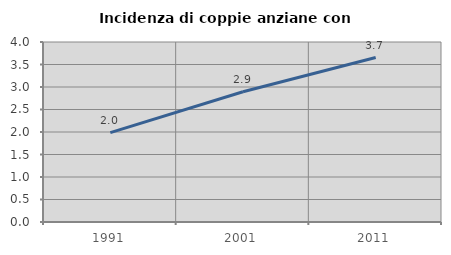
| Category | Incidenza di coppie anziane con figli |
|---|---|
| 1991.0 | 1.987 |
| 2001.0 | 2.894 |
| 2011.0 | 3.655 |